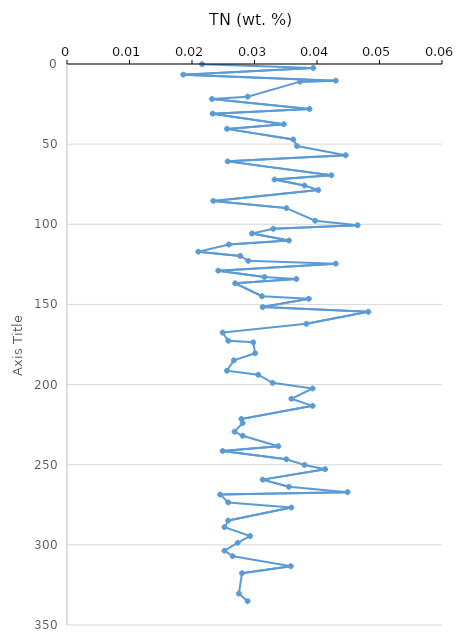
| Category | Series 0 |
|---|---|
| 0.0216 | 0.09 |
| 0.0394 | 2.45 |
| 0.0186 | 6.64 |
| 0.043 | 10.4 |
| 0.0373 | 11 |
| 0.0289 | 20.37 |
| 0.0232 | 21.84 |
| 0.0388 | 28.06 |
| 0.0233 | 30.99 |
| 0.0347 | 37.56 |
| 0.0256 | 40.48 |
| 0.0362 | 47.1 |
| 0.0368 | 51.15 |
| 0.0446 | 56.91 |
| 0.0257 | 60.75 |
| 0.0423 | 69.4 |
| 0.0332 | 72.11 |
| 0.038 | 75.82 |
| 0.0402 | 78.63 |
| 0.0234 | 85.41 |
| 0.0351 | 89.91 |
| 0.0397 | 97.78 |
| 0.0465 | 100.59 |
| 0.033 | 102.8 |
| 0.0296 | 105.71 |
| 0.0355 | 110.13 |
| 0.0259 | 112.6 |
| 0.021 | 117.11 |
| 0.0277 | 119.74 |
| 0.029 | 122.79 |
| 0.043 | 124.55 |
| 0.0242 | 128.93 |
| 0.0316 | 132.92 |
| 0.0367 | 134.15 |
| 0.0269 | 136.82 |
| 0.0312 | 144.84 |
| 0.0387 | 146.48 |
| 0.0313 | 151.66 |
| 0.0482 | 154.61 |
| 0.0383 | 162.1 |
| 0.0249 | 167.56 |
| 0.0258 | 172.66 |
| 0.0298 | 173.63 |
| 0.0301 | 180.44 |
| 0.0267 | 184.87 |
| 0.0256 | 191.39 |
| 0.0306 | 193.86 |
| 0.0329 | 198.92 |
| 0.0393 | 202.43 |
| 0.0359 | 208.85 |
| 0.0393 | 213.27 |
| 0.0279 | 221.46 |
| 0.0281 | 223.94 |
| 0.0268 | 229.39 |
| 0.0281 | 231.96 |
| 0.0338 | 238.44 |
| 0.0249 | 241.45 |
| 0.0351 | 246.6 |
| 0.038 | 250.12 |
| 0.0413 | 252.81 |
| 0.0313 | 259.31 |
| 0.0355 | 263.76 |
| 0.0449 | 267.12 |
| 0.0245 | 268.62 |
| 0.0258 | 273.52 |
| 0.0359 | 276.71 |
| 0.0258 | 284.82 |
| 0.0252 | 288.95 |
| 0.0293 | 294.51 |
| 0.0273 | 298.74 |
| 0.0252 | 303.64 |
| 0.0265 | 307.06 |
| 0.0358 | 313.3 |
| 0.028 | 317.7 |
| 0.0275 | 330.4 |
| 0.0289 | 335.12 |